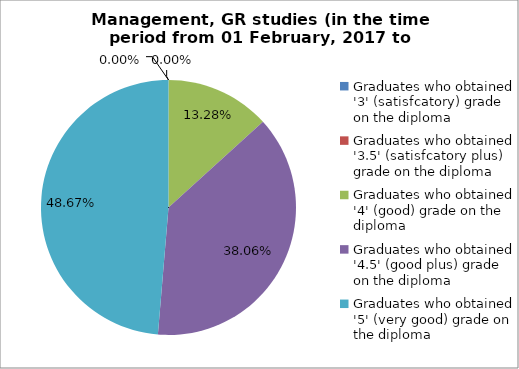
| Category | Series 0 |
|---|---|
| Graduates who obtained '3' (satisfcatory) grade on the diploma  | 0 |
| Graduates who obtained '3.5' (satisfcatory plus) grade on the diploma  | 0 |
| Graduates who obtained '4' (good) grade on the diploma  | 13.274 |
| Graduates who obtained '4.5' (good plus) grade on the diploma  | 38.053 |
| Graduates who obtained '5' (very good) grade on the diploma  | 48.673 |